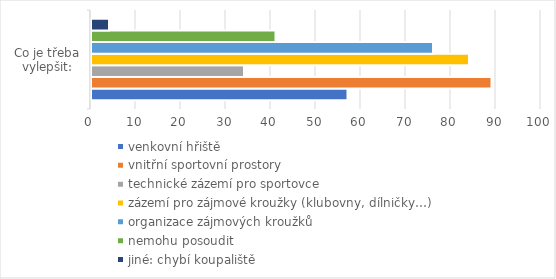
| Category | venkovní hřiště | vnitřní sportovní prostory | technické zázemí pro sportovce | zázemí pro zájmové kroužky (klubovny, dílničky…) | organizace zájmových kroužků | nemohu posoudit | jiné: chybí koupaliště |
|---|---|---|---|---|---|---|---|
| 0 | 57 | 89 | 34 | 84 | 76 | 41 | 4 |